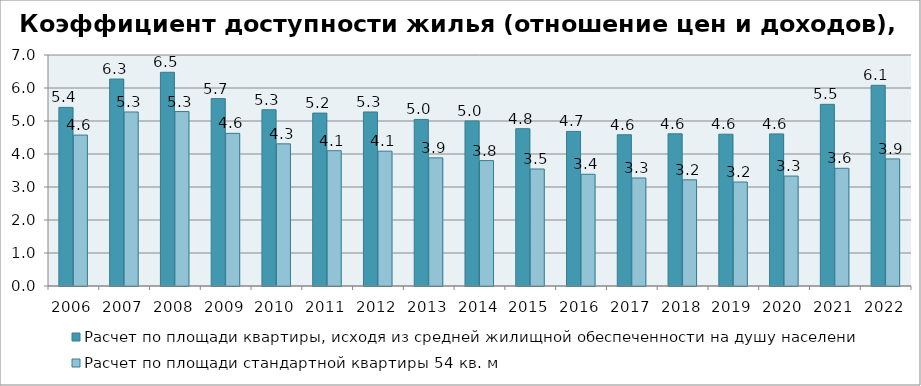
| Category | Расчет по площади квартиры, исходя из средней жилищной обеспеченности на душу населения  | Расчет по площади стандартной квартиры 54 кв. м |
|---|---|---|
| 2006 | 5.412 | 4.574 |
| 2007 | 6.272 | 5.273 |
| 2008 | 6.476 | 5.286 |
| 2009 | 5.678 | 4.625 |
| 2010 | 5.341 | 4.308 |
| 2011 | 5.239 | 4.1 |
| 2012 | 5.274 | 4.085 |
| 2013 | 5.047 | 3.883 |
| 2014 | 5.001 | 3.8 |
| 2015 | 4.767 | 3.546 |
| 2016 | 4.684 | 3.386 |
| 2017 | 4.583 | 3.274 |
| 2018 | 4.612 | 3.218 |
| 2019 | 4.599 | 3.15 |
| 2020 | 4.609 | 3.332 |
| 2021 | 5.505 | 3.567 |
| 2022 | 6.081 | 3.851 |